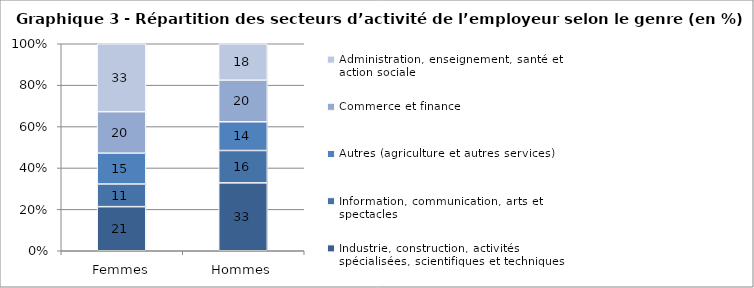
| Category | Industrie, construction, activités spécialisées, scientifiques et techniques | Information, communication, arts et spectacles | Autres (agriculture et autres services) | Commerce et finance | Administration, enseignement, santé et action sociale |
|---|---|---|---|---|---|
| Femmes | 21.3 | 10.95 | 14.9 | 20.04 | 32.82 |
| Hommes | 32.8 | 15.63 | 13.87 | 20.09 | 17.61 |